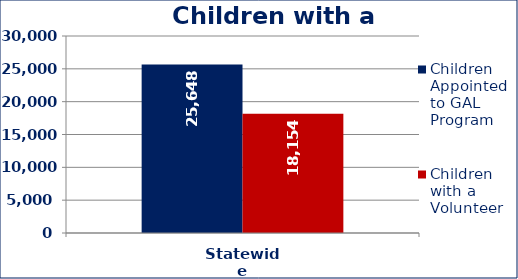
| Category | Children Appointed to GAL Program  | Children with a Volunteer  |
|---|---|---|
| Statewide | 25648 | 18154 |